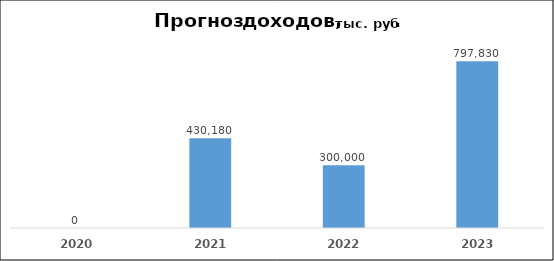
| Category | Series 0 |
|---|---|
| 2020.0 | 0 |
| 2021.0 | 430180 |
| 2022.0 | 300000 |
| 2023.0 | 797830 |